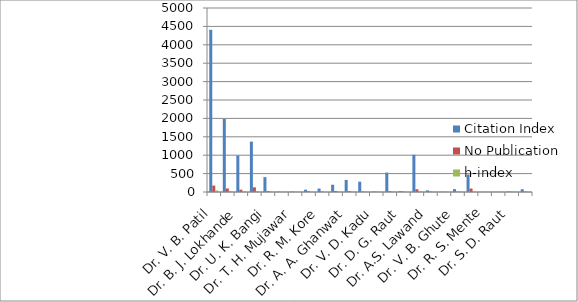
| Category | Citation Index | No Publication | h-index |
|---|---|---|---|
| Dr. V. B. Patil | 4408 | 174 | 41 |
| Dr. S. S. Suryawanshi | 1984 | 96 | 28 |
| Dr. B. J. Lokhande | 993 | 63 | 18 |
| Dr. L. P. Deshmukh | 1370 | 127 | 22 |
| Dr. U. K. Bangi | 404 | 26 | 11 |
| Dr. V. D. Bachuwar | 9 | 3 | 2 |
| Dr. T. H. Mujawar | 12 | 4 | 2 |
| Mr. V. M. Prakshale | 63 | 18 | 4 |
| Dr. R. M. Kore | 93 | 11 | 3 |
| Dr. R. B. Bhosale | 198 | 26 | 9 |
| Dr. A. A. Ghanwat | 328 | 25 | 11 |
| Dr. S. N. Shringare | 280 | 13 | 8 |
| Dr. V. D. Kadu | 13 | 7 | 2 |
| Dr. M. G. Mali | 527 | 20 | 12 |
| Dr. D. G. Raut | 24 | 9 | 3 |
| Dr. N. N. Maldar | 1011 | 75 | 17 |
| Dr. A.S. Lawand | 45 | 10 | 4 |
| Dr. V. P. Dhulap | 5 | 4 | 1 |
| Dr. V. B. Ghute | 78 | 8 | 4 |
| Dr. R. S. Hegadi | 476 | 93 | 11 |
| Dr. R. S. Mente | 0 | 2 | 0 |
| Dr. J. D. Mashale | 1 | 2 | 0 |
| Dr. S. D. Raut | 14 | 6 | 3 |
| Dr. P. M. Kamble | 74 | 7 | 4 |